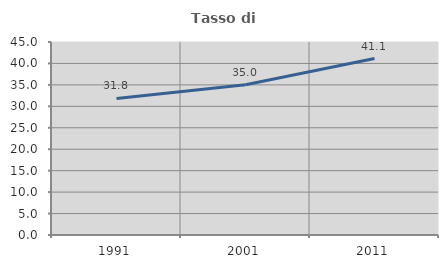
| Category | Tasso di occupazione   |
|---|---|
| 1991.0 | 31.829 |
| 2001.0 | 35.02 |
| 2011.0 | 41.14 |